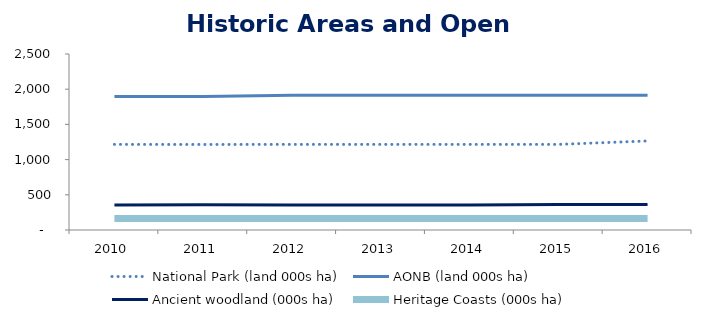
| Category | National Park (land 000s ha) | AONB (land 000s ha) | Ancient woodland (000s ha) | Heritage Coasts (000s ha) |
|---|---|---|---|---|
| 2010.0 | 1216 | 1897 | 355 | 164 |
| 2011.0 | 1215 | 1897 | 359 | 164.283 |
| 2012.0 | 1216 | 1914 | 354 | 164 |
| 2013.0 | 1216 | 1914 | 354 | 164 |
| 2014.0 | 1216 | 1914 | 354 | 164 |
| 2015.0 | 1216 | 1914 | 360.671 | 164 |
| 2016.0 | 1265 | 1915 | 360.671 | 164 |